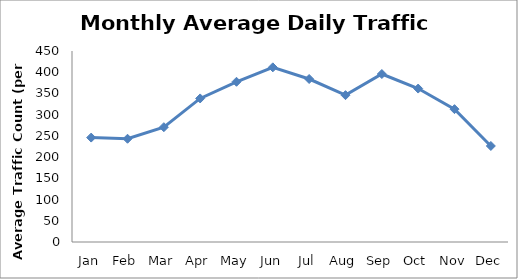
| Category | Series 0 |
|---|---|
| Jan | 246 |
| Feb | 243.25 |
| Mar | 270.5 |
| Apr | 338.25 |
| May | 377.5 |
| Jun | 411.5 |
| Jul | 384 |
| Aug | 346 |
| Sep | 395.75 |
| Oct | 361.5 |
| Nov | 313 |
| Dec | 226.25 |